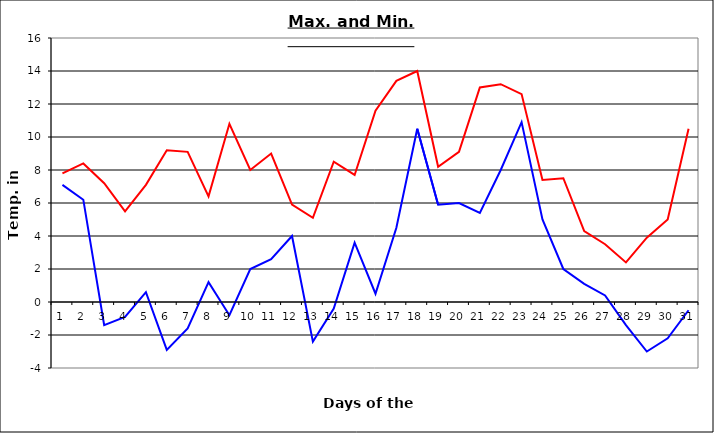
| Category | Series 0 | Series 1 |
|---|---|---|
| 0 | 7.8 | 7.1 |
| 1 | 8.4 | 6.2 |
| 2 | 7.2 | -1.4 |
| 3 | 5.5 | -0.9 |
| 4 | 7.1 | 0.6 |
| 5 | 9.2 | -2.9 |
| 6 | 9.1 | -1.6 |
| 7 | 6.4 | 1.2 |
| 8 | 10.8 | -0.8 |
| 9 | 8 | 2 |
| 10 | 9 | 2.6 |
| 11 | 5.9 | 4 |
| 12 | 5.1 | -2.4 |
| 13 | 8.5 | -0.4 |
| 14 | 7.7 | 3.6 |
| 15 | 11.6 | 0.5 |
| 16 | 13.4 | 4.5 |
| 17 | 14 | 10.5 |
| 18 | 8.2 | 5.9 |
| 19 | 9.1 | 6 |
| 20 | 13 | 5.4 |
| 21 | 13.2 | 8 |
| 22 | 12.6 | 10.9 |
| 23 | 7.4 | 5 |
| 24 | 7.5 | 2 |
| 25 | 4.3 | 1.1 |
| 26 | 3.5 | 0.4 |
| 27 | 2.4 | -1.4 |
| 28 | 3.9 | -3 |
| 29 | 5 | -2.2 |
| 30 | 10.5 | -0.5 |